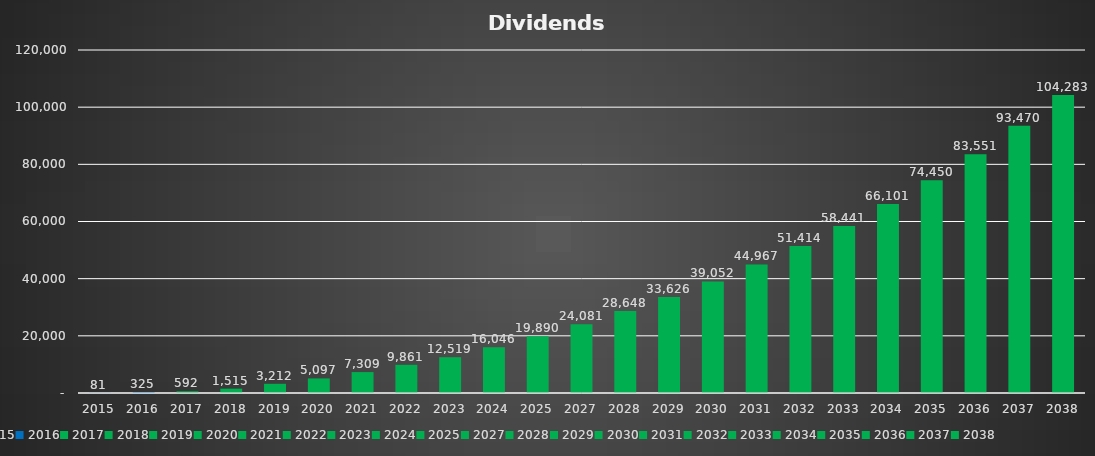
| Category | Dividends |
|---|---|
| 2015.0 | 81.45 |
| 2016.0 | 324.6 |
| 2017.0 | 591.703 |
| 2018.0 | 1514.712 |
| 2019.0 | 3212.277 |
| 2020.0 | 5097.429 |
| 2021.0 | 7309.064 |
| 2022.0 | 9860.762 |
| 2023.0 | 12519.472 |
| 2024.0 | 16046.224 |
| 2025.0 | 19890.385 |
| 2027.0 | 24080.519 |
| 2028.0 | 28647.766 |
| 2029.0 | 33626.065 |
| 2030.0 | 39052.411 |
| 2031.0 | 44967.128 |
| 2032.0 | 51414.169 |
| 2033.0 | 58441.444 |
| 2034.0 | 66101.174 |
| 2035.0 | 74450.28 |
| 2036.0 | 83550.805 |
| 2037.0 | 93470.378 |
| 2038.0 | 104282.712 |